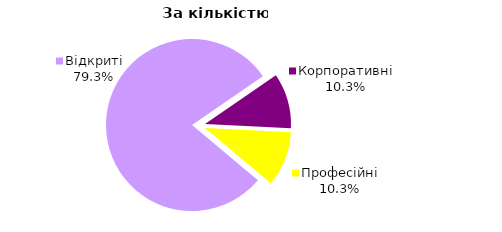
| Category | Series 0 |
|---|---|
| Відкриті | 46 |
| Корпоративні | 6 |
| Професійні | 6 |